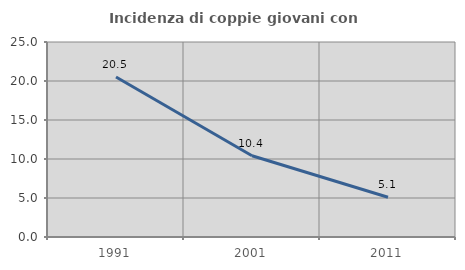
| Category | Incidenza di coppie giovani con figli |
|---|---|
| 1991.0 | 20.512 |
| 2001.0 | 10.413 |
| 2011.0 | 5.101 |